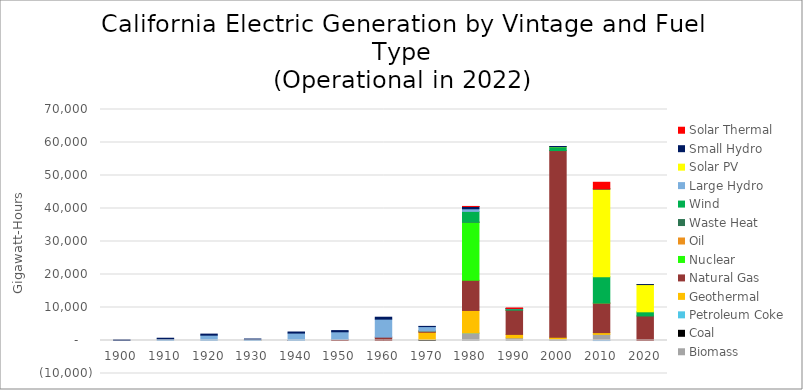
| Category | Biomass | Coal | Petroleum Coke | Geothermal | Natural Gas | Nuclear | Oil | Waste Heat | Wind | Large Hydro | Solar PV | Small Hydro | Solar Thermal |
|---|---|---|---|---|---|---|---|---|---|---|---|---|---|
| 1900.0 | 0 | 0 | 0 | 0 | 0 | 0 | 0 | 0 | 0 | 0 | 0 | 205.386 | 0 |
| 1910.0 | 0 | 0 | 0 | 0 | 0 | 0 | 0 | 0 | 0 | 459.434 | 0 | 228.028 | 0 |
| 1920.0 | 0 | 0 | 0 | 0 | 0 | 0 | 0 | 0 | 0 | 1621.414 | 0 | 316.111 | 0 |
| 1930.0 | 0 | 0 | 0 | 0 | 0 | 0 | 0.001 | 0 | 0 | 354.078 | 0 | 86.008 | 0 |
| 1940.0 | 0 | 0 | 0 | 0 | 1.767 | 0 | 0 | 0 | 0 | 2249.803 | 0 | 321.287 | 0 |
| 1950.0 | 0 | 0 | 0 | 0 | 345.486 | 0 | 0 | 0 | 0 | 2296.897 | 0 | 359.995 | 0 |
| 1960.0 | 0 | 0 | 0 | 0 | 1014.426 | 0 | 0 | 0 | 0 | 5462.25 | 0 | 578.202 | 0 |
| 1970.0 | 0 | 273.025 | 0 | 2230.627 | 325.428 | 0 | 33.063 | 16.988 | 0 | 1339.104 | 0 | 58.467 | 0 |
| 1980.0 | 2179.38 | 0 | 99.946 | 6822.442 | 9124.301 | 17627.428 | 2.05 | 0 | 3269.372 | 788.519 | 0 | 703.277 | 0 |
| 1990.0 | 815.249 | 0 | 0 | 1033.985 | 7256.566 | 0 | 29.96 | 198.478 | 280.503 | 53.29 | 0 | 53.745 | 121.179 |
| 2000.0 | 519.23 | 0 | 0 | 485.392 | 56556.015 | 0 | 0 | 0 | 1152.807 | 0 | 61.146 | 19.078 | 0 |
| 2010.0 | 1851.986 | 0 | 0 | 537.846 | 8937.974 | 0 | 0.071 | 0 | 7997.951 | -18.258 | 26571.411 | 67.12 | 1981.162 |
| 2020.0 | 0 | 0 | 0 | 0 | 7432.626 | 0 | 0 | 0 | 1262.586 | 0 | 8253.421 | 8.015 | 0 |